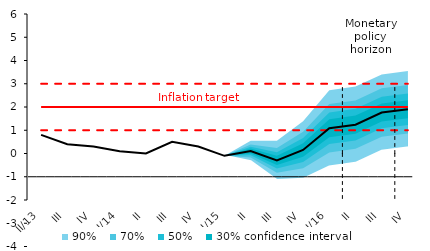
| Category | Inflation Target | Inflation Target - lower bound | Inflation Target - upper bound | Střed předpovědi |
|---|---|---|---|---|
| II/13 | 2 | 1 | 3 | 0.8 |
| III | 2 | 1 | 3 | 0.4 |
| IV | 2 | 1 | 3 | 0.3 |
| I/14 | 2 | 1 | 3 | 0.1 |
| II | 2 | 1 | 3 | 0 |
| III | 2 | 1 | 3 | 0.5 |
| IV | 2 | 1 | 3 | 0.3 |
| I/15 | 2 | 1 | 3 | -0.1 |
| II | 2 | 1 | 3 | 0.107 |
| III | 2 | 1 | 3 | -0.298 |
| IV | 2 | 1 | 3 | 0.151 |
| I/16 | 2 | 1 | 3 | 1.085 |
| II | 2 | 1 | 3 | 1.24 |
| III | 2 | 1 | 3 | 1.762 |
| IV | 2 | 1 | 3 | 1.904 |